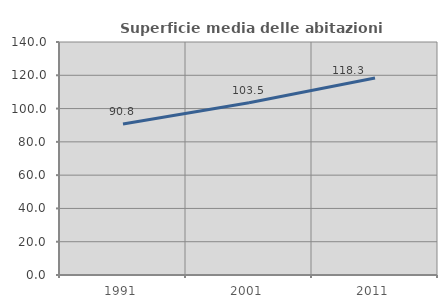
| Category | Superficie media delle abitazioni occupate |
|---|---|
| 1991.0 | 90.784 |
| 2001.0 | 103.452 |
| 2011.0 | 118.345 |